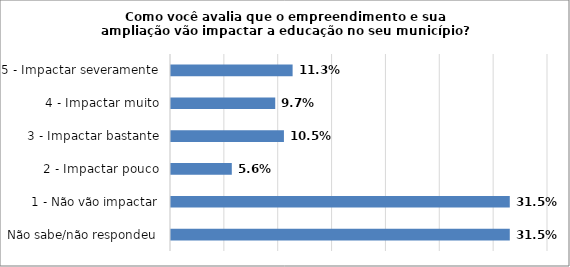
| Category | Series 0 |
|---|---|
| Não sabe/não respondeu | 0.315 |
| 1 - Não vão impactar | 0.315 |
| 2 - Impactar pouco | 0.056 |
| 3 - Impactar bastante | 0.105 |
| 4 - Impactar muito | 0.097 |
| 5 - Impactar severamente | 0.113 |